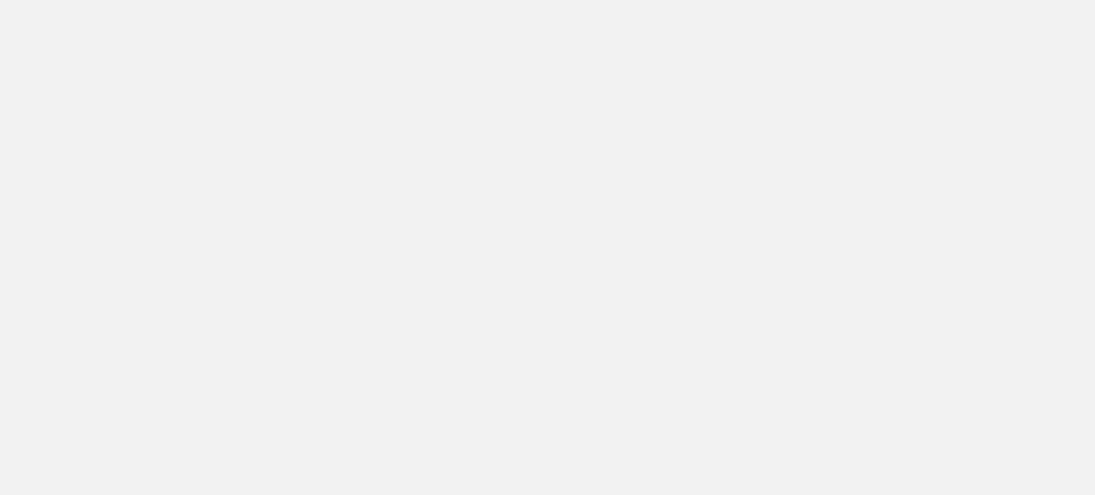
| Category | Total |
|---|---|
| Hajjah | 81538 |
| Al Hodeidah | 67572 |
| Marib | 39134 |
| Al Jawf | 14118 |
| Taiz | 12832 |
| Hadramawt | 8194 |
| Lahj | 4752 |
| Sadah | 4454 |
| Abyan | 4156 |
| Amran | 4119 |
| Sanaa | 3887 |
| Ad Dali | 3721 |
| Aden | 3462 |
| Ibb | 2707 |
| Al Bayda | 1615 |
| Dhamar | 1295 |
| Al Mahwit | 1241 |
| Shabwah | 1015 |
| Al Maharah | 457 |
| Raymah | 451 |
| Sanaa City | 167 |
| Socotra | 15 |